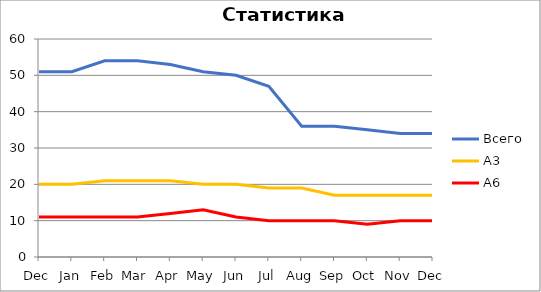
| Category | Всего | А3 | A6 |
|---|---|---|---|
| Dec | 51 | 20 | 11 |
| Jan | 51 | 20 | 11 |
| Feb | 54 | 21 | 11 |
| Mar | 54 | 21 | 11 |
| Apr | 53 | 21 | 12 |
| May | 51 | 20 | 13 |
| Jun | 50 | 20 | 11 |
| Jul | 47 | 19 | 10 |
| Aug | 36 | 19 | 10 |
| Sep | 36 | 17 | 10 |
| Oct | 35 | 17 | 9 |
| Nov | 34 | 17 | 10 |
| Dec | 34 | 17 | 10 |